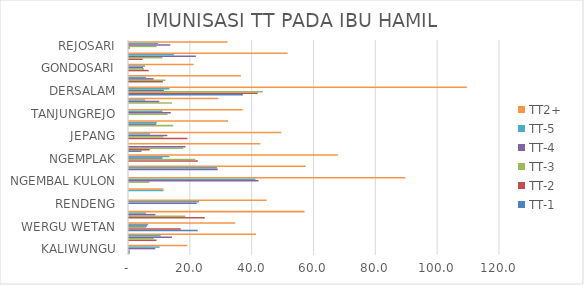
| Category | TT-1 | TT-2 | TT-3 | TT-4 | TT-5 | TT2+ |
|---|---|---|---|---|---|---|
| KALIWUNGU | 0.222 | 0.222 | 0.222 | 8.512 | 9.919 | 18.875 |
| SIDOREKSO | 0 | 8.918 | 8.041 | 13.889 | 10.234 | 41.082 |
| WERGU WETAN | 22.242 | 16.726 | 5.516 | 5.872 | 6.228 | 34.342 |
| PURWOSARI | 0 | 24.516 | 18.226 | 8.548 | 5.484 | 56.774 |
| RENDENG | 0 | 0 | 0 | 21.887 | 22.642 | 44.528 |
| JATI | 0 | 0 | 0 | 0 | 11.168 | 11.168 |
| NGEMBAL KULON | 0 | 0 | 6.602 | 41.883 | 40.909 | 89.394 |
| UNDAAN | 0 | 0 | 0 | 28.702 | 28.44 | 57.143 |
| NGEMPLAK | 0 | 22.258 | 21.452 | 10.806 | 13.065 | 67.581 |
| MEJOBO | 4.035 | 6.683 | 17.528 | 18.285 | 0 | 42.497 |
| JEPANG | 0 | 18.926 | 11.125 | 12.404 | 6.777 | 49.233 |
| JEKULO | 0 | 0 | 14.286 | 8.774 | 8.999 | 32.058 |
| TANJUNGREJO | 0 | 0 | 12.48 | 13.52 | 10.8 | 36.8 |
| BAE | 0 | 0 | 13.885 | 9.809 | 5.223 | 28.917 |
| DERSALAM | 36.816 | 41.625 | 43.284 | 11.277 | 13.101 | 109.287 |
| GRIBIG | 0 | 10.95 | 11.805 | 7.956 | 5.475 | 36.185 |
| GONDOSARI | 0 | 6.365 | 4.854 | 4.531 | 5.178 | 20.928 |
| DAWE | 0 | 4.371 | 10.813 | 21.626 | 14.494 | 51.304 |
| REJOSARI | 0 | 0.261 | 8.889 | 13.333 | 9.412 | 31.895 |